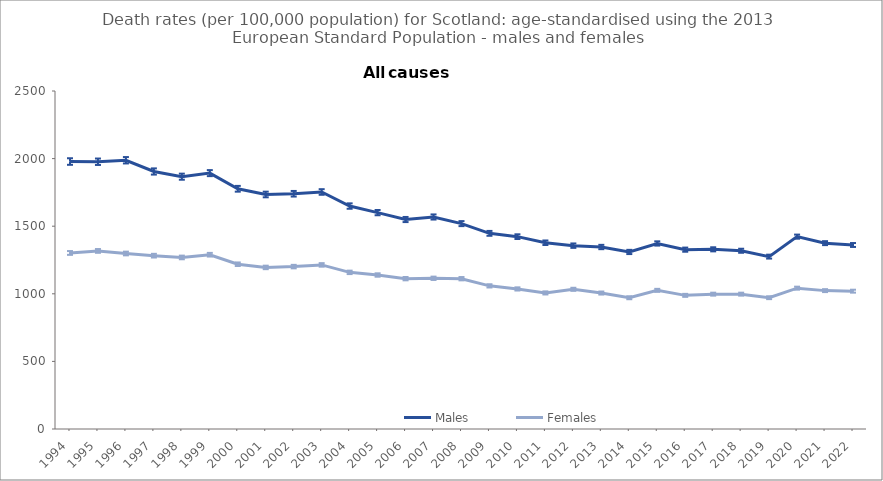
| Category | Males | Females |
|---|---|---|
| 1994.0 | 1978.3 | 1302.1 |
| 1995.0 | 1976.7 | 1317.2 |
| 1996.0 | 1987.8 | 1298.1 |
| 1997.0 | 1904.7 | 1282 |
| 1998.0 | 1866.2 | 1268.9 |
| 1999.0 | 1892.6 | 1289.1 |
| 2000.0 | 1776.8 | 1218.6 |
| 2001.0 | 1734.6 | 1195.1 |
| 2002.0 | 1740 | 1201.2 |
| 2003.0 | 1753.1 | 1213.7 |
| 2004.0 | 1649 | 1158.6 |
| 2005.0 | 1600.5 | 1139 |
| 2006.0 | 1549.4 | 1112 |
| 2007.0 | 1568.1 | 1114.7 |
| 2008.0 | 1519.1 | 1111.7 |
| 2009.0 | 1447.1 | 1058.7 |
| 2010.0 | 1422.7 | 1036 |
| 2011.0 | 1377.7 | 1006.5 |
| 2012.0 | 1356.1 | 1033.2 |
| 2013.0 | 1346.1 | 1005.6 |
| 2014.0 | 1309.5 | 970.9 |
| 2015.0 | 1372.3 | 1025.5 |
| 2016.0 | 1326.5 | 988.5 |
| 2017.0 | 1329 | 997.4 |
| 2018.0 | 1318.4 | 997.4 |
| 2019.0 | 1275 | 971.2 |
| 2020.0 | 1422.8 | 1041.7 |
| 2021.0 | 1374.7 | 1023.5 |
| 2022.0 | 1361 | 1019.4 |